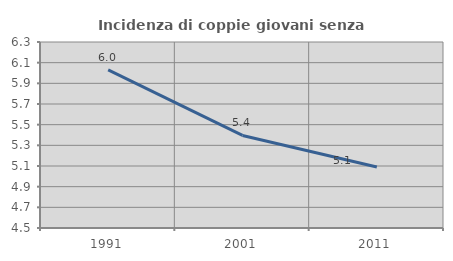
| Category | Incidenza di coppie giovani senza figli |
|---|---|
| 1991.0 | 6.031 |
| 2001.0 | 5.396 |
| 2011.0 | 5.09 |